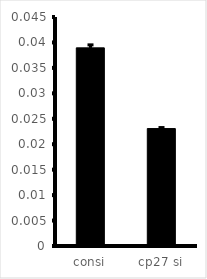
| Category | Series 0 |
|---|---|
| consi | 0.039 |
| cp27 si | 0.023 |